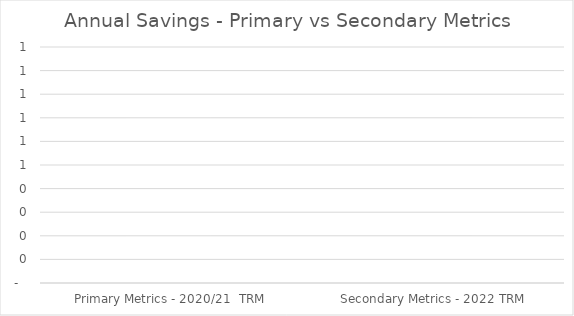
| Category | Series 0 |
|---|---|
|  Primary Metrics - 2020/21  TRM  | 0 |
|  Secondary Metrics - 2022 TRM  | 0 |